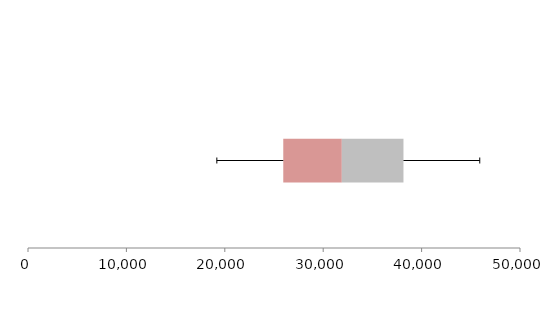
| Category | Series 1 | Series 2 | Series 3 |
|---|---|---|---|
| 0 | 25941.737 | 5950.975 | 6264.744 |